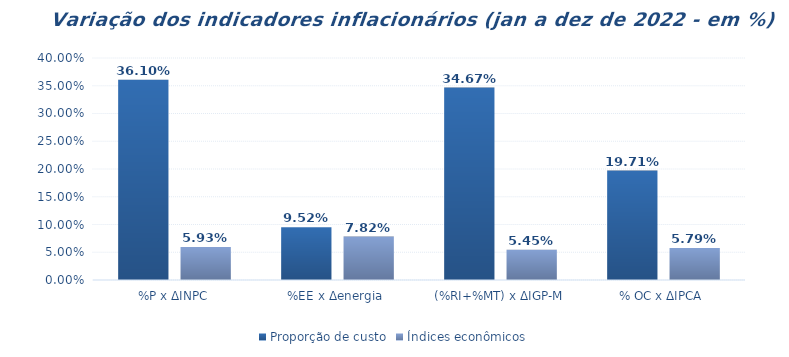
| Category | Proporção de custo | Índices econômicos |
|---|---|---|
| %P x ΔINPC | 0.361 | 0.059 |
| %EE x Δenergia | 0.095 | 0.078 |
| (%RI+%MT) x ΔIGP-M | 0.347 | 0.055 |
| % OC x ΔIPCA | 0.197 | 0.058 |